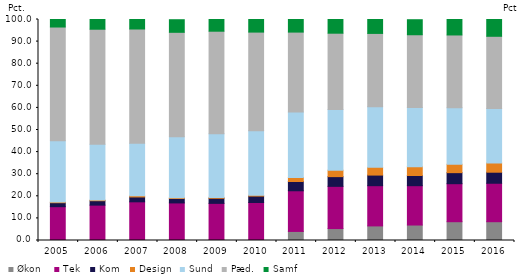
| Category | Økon  | Tek | Kom | Design | Sund | Pæd. | Samf |
|---|---|---|---|---|---|---|---|
| 2005.0 | 0.2 | 15.1 | 1.8 | 0.3 | 27.7 | 51.5 | 3.4 |
| 2006.0 | 0.1 | 15.9 | 2 | 0.3 | 25.2 | 52.1 | 4.4 |
| 2007.0 | 0.1 | 17.4 | 2.2 | 0.5 | 23.8 | 51.7 | 4.4 |
| 2008.0 | 0.3 | 16.7 | 2 | 0.4 | 27.5 | 47.3 | 5.7 |
| 2009.0 | 0.3 | 16.5 | 2.3 | 0.4 | 28.8 | 46.4 | 5.3 |
| 2010.0 | 0.1 | 17.1 | 2.9 | 0.4 | 29.2 | 44.6 | 5.7 |
| 2011.0 | 4.1 | 18.4 | 4.2 | 1.8 | 29.6 | 36.2 | 5.8 |
| 2012.0 | 5.4 | 19.1 | 4.4 | 2.9 | 27.5 | 34.5 | 6.3 |
| 2013.0 | 6.6 | 18.2 | 4.8 | 3.5 | 27.4 | 33.2 | 6.4 |
| 2014.0 | 7 | 17.8 | 4.6 | 4 | 26.8 | 32.9 | 6.8 |
| 2015.0 | 8.5 | 17.2 | 5 | 3.8 | 25.6 | 32.9 | 7 |
| 2016.0 | 8.5 | 17.4 | 5 | 4.2 | 24.6 | 32.7 | 7.6 |